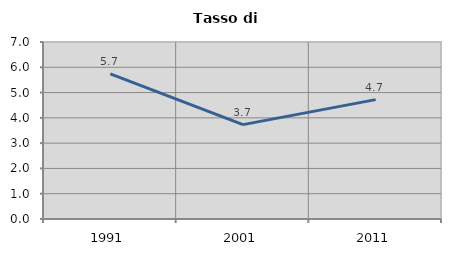
| Category | Tasso di disoccupazione   |
|---|---|
| 1991.0 | 5.743 |
| 2001.0 | 3.732 |
| 2011.0 | 4.722 |